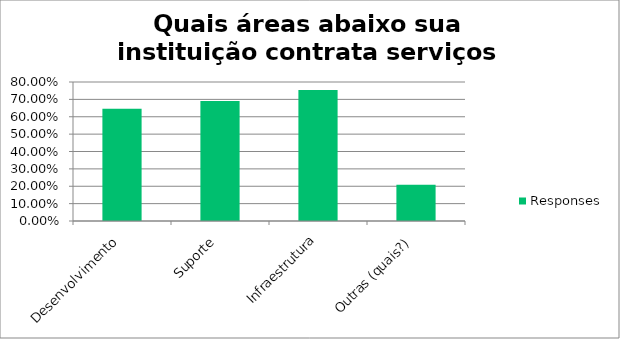
| Category | Responses |
|---|---|
| Desenvolvimento | 0.646 |
| Suporte | 0.691 |
| Infraestrutura | 0.755 |
| Outras (quais?) | 0.209 |